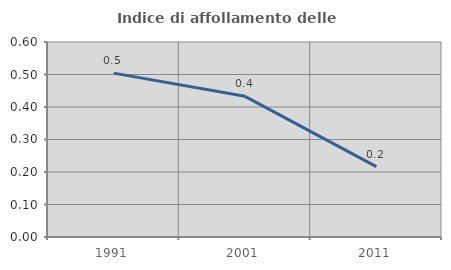
| Category | Indice di affollamento delle abitazioni  |
|---|---|
| 1991.0 | 0.504 |
| 2001.0 | 0.433 |
| 2011.0 | 0.216 |